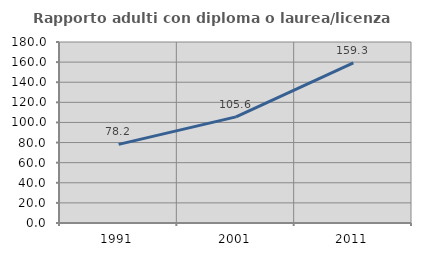
| Category | Rapporto adulti con diploma o laurea/licenza media  |
|---|---|
| 1991.0 | 78.172 |
| 2001.0 | 105.551 |
| 2011.0 | 159.321 |